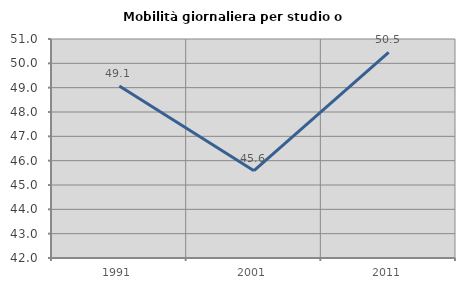
| Category | Mobilità giornaliera per studio o lavoro |
|---|---|
| 1991.0 | 49.067 |
| 2001.0 | 45.589 |
| 2011.0 | 50.453 |